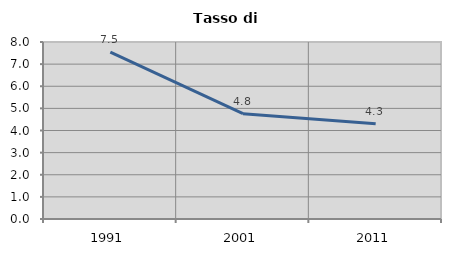
| Category | Tasso di disoccupazione   |
|---|---|
| 1991.0 | 7.547 |
| 2001.0 | 4.762 |
| 2011.0 | 4.301 |